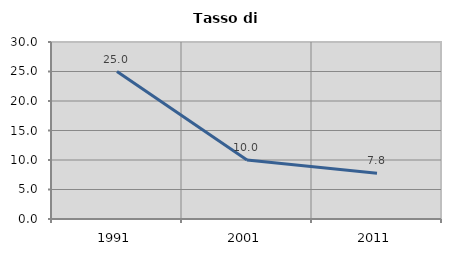
| Category | Tasso di disoccupazione   |
|---|---|
| 1991.0 | 25 |
| 2001.0 | 10 |
| 2011.0 | 7.752 |